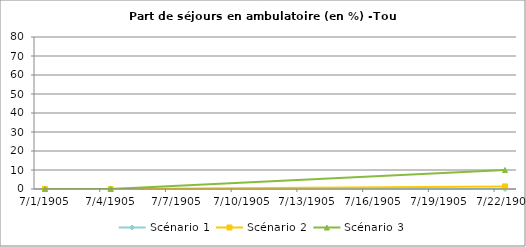
| Category | Scénario 1 | Scénario 2 | Scénario 3 |
|---|---|---|---|
| 2009.0 | 0.005 | 0.005 | 0.005 |
| 2012.0 | 0.005 | 0.005 | 0.005 |
| 2030.0 | 0.006 | 1.365 | 10 |